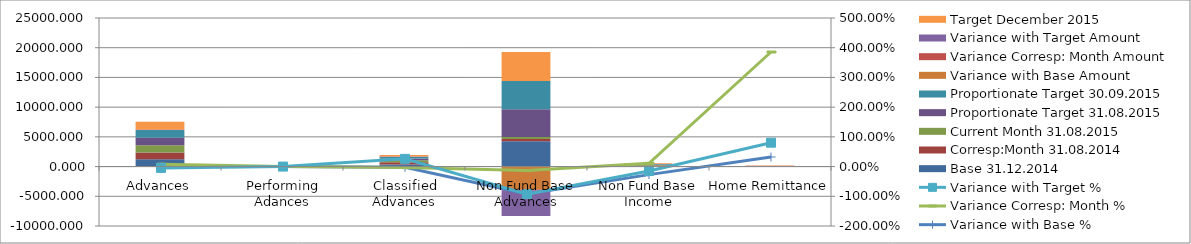
| Category | Base 31.12.2014 | Corresp:Month 31.08.2014 | Current Month 31.08.2015 | Proportionate Target 31.08.2015 | Proportionate Target 30.09.2015 | Variance with Base Amount  | Variance Corresp: Month Amount | Variance with Target Amount | Target December 2015 |
|---|---|---|---|---|---|---|---|---|---|
| Advances | 1220.997 | 1135.671 | 1224.341 | 1281.457 | 1280.02 | 3.344 | 88.67 | -57.116 | 1311.686 |
| Performing Adances | 0 | 0 | 0 | 0 | 0 | 0 | 0 | 0 | 0 |
| Classified Advances | 361.963 | 365.632 | 352.939 | 280.122 | 260.898 | -9.024 | -12.693 | 72.817 | 239.201 |
| Non Fund Base Advances | 4252.174 | 389.194 | 337.641 | 4677.391 | 4730.543 | -3914.533 | -51.553 | -4339.75 | 4890 |
| Non Fund Base Income | 103.716 | 68.133 | 75.644 | 88.603 | 99.679 | -28.072 | 7.511 | -12.959 | 132.905 |
| Home Remittance | 25.082 | 6.832 | 33.172 | 18.393 | 20.693 | 8.09 | 26.34 | 14.779 | 27.59 |